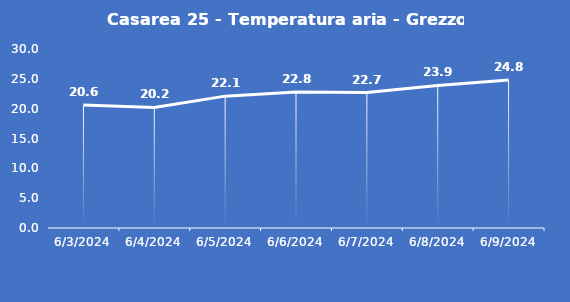
| Category | Casarea 25 - Temperatura aria - Grezzo (°C) |
|---|---|
| 6/3/24 | 20.6 |
| 6/4/24 | 20.2 |
| 6/5/24 | 22.1 |
| 6/6/24 | 22.8 |
| 6/7/24 | 22.7 |
| 6/8/24 | 23.9 |
| 6/9/24 | 24.8 |